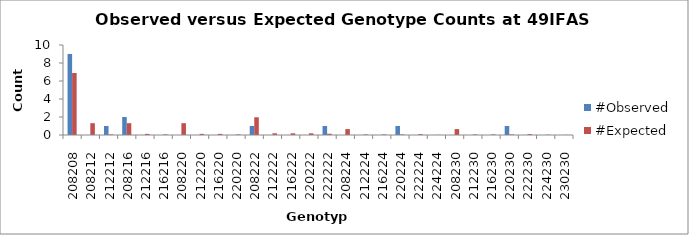
| Category | #Observed | #Expected |
|---|---|---|
| 208208.0 | 9 | 6.891 |
| 208212.0 | 0 | 1.312 |
| 212212.0 | 1 | 0.062 |
| 208216.0 | 2 | 1.312 |
| 212216.0 | 0 | 0.125 |
| 216216.0 | 0 | 0.062 |
| 208220.0 | 0 | 1.312 |
| 212220.0 | 0 | 0.125 |
| 216220.0 | 0 | 0.125 |
| 220220.0 | 0 | 0.062 |
| 208222.0 | 1 | 1.969 |
| 212222.0 | 0 | 0.188 |
| 216222.0 | 0 | 0.188 |
| 220222.0 | 0 | 0.188 |
| 222222.0 | 1 | 0.141 |
| 208224.0 | 0 | 0.656 |
| 212224.0 | 0 | 0.062 |
| 216224.0 | 0 | 0.062 |
| 220224.0 | 1 | 0.062 |
| 222224.0 | 0 | 0.094 |
| 224224.0 | 0 | 0.016 |
| 208230.0 | 0 | 0.656 |
| 212230.0 | 0 | 0.062 |
| 216230.0 | 0 | 0.062 |
| 220230.0 | 1 | 0.062 |
| 222230.0 | 0 | 0.094 |
| 224230.0 | 0 | 0.031 |
| 230230.0 | 0 | 0.016 |